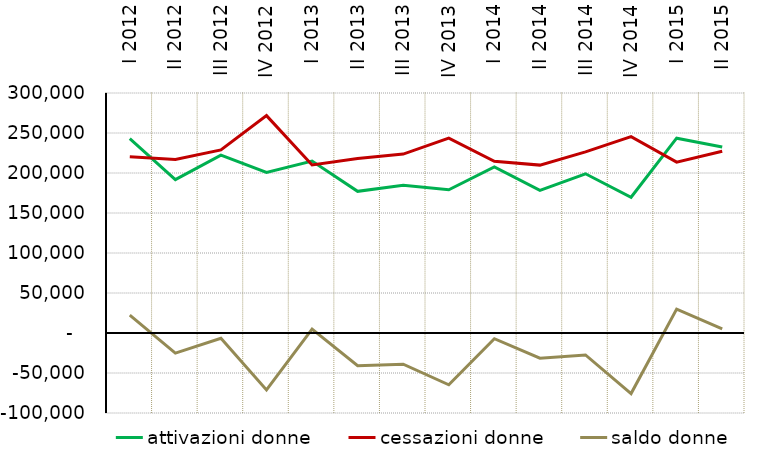
| Category | attivazioni donne | cessazioni donne | saldo donne |
|---|---|---|---|
| I 2012 | 242846 | 220428 | 22418 |
| II 2012 | 191708 | 216869 | -25161 |
| III 2012 | 222296 | 228939 | -6643 |
| IV 2012 | 200631 | 271732 | -71101 |
| I 2013 | 214929 | 210084 | 4845 |
| II 2013 | 177059 | 218042 | -40983 |
| III 2013 | 184610 | 223655 | -39045 |
| IV 2013 | 178975 | 243657 | -64682 |
| I 2014 | 207471 | 214622 | -7151 |
| II 2014 | 178335 | 209862 | -31527 |
| III 2014 | 199050 | 226446 | -27396 |
| IV 2014 | 169677 | 245409 | -75732 |
| I 2015 | 243492 | 213567 | 29925 |
| II 2015 | 232502 | 227200 | 5302 |